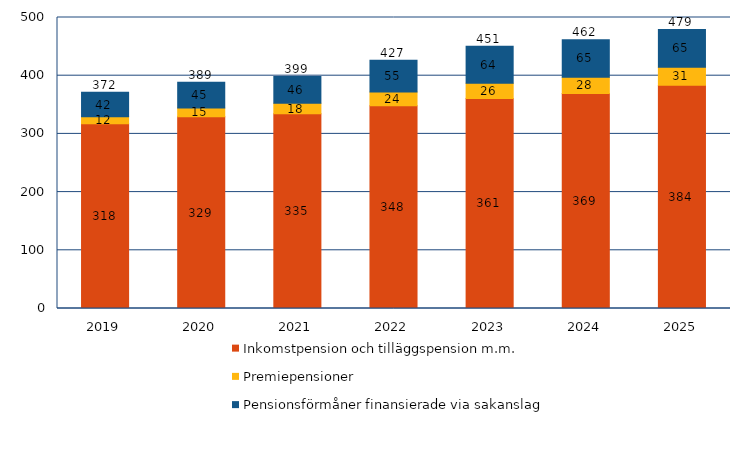
| Category | Inkomstpension och tilläggspension m.m. | Premiepensioner | Pensionsförmåner finansierade via sakanslag | Series 3 |
|---|---|---|---|---|
| 2019.0 | 317.628 | 11.715 | 42.22 | 371.563 |
| 2020.0 | 329.365 | 15.016 | 44.546 | 388.927 |
| 2021.0 | 334.629 | 17.837 | 46.327 | 398.793 |
| 2022.0 | 348.202 | 23.669 | 54.695 | 426.566 |
| 2023.0 | 361.006 | 25.953 | 63.831 | 450.79 |
| 2024.0 | 369.226 | 28.151 | 64.605 | 461.982 |
| 2025.0 | 383.635 | 30.926 | 64.809 | 479.37 |